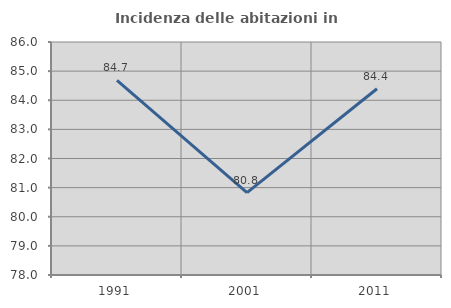
| Category | Incidenza delle abitazioni in proprietà  |
|---|---|
| 1991.0 | 84.679 |
| 2001.0 | 80.828 |
| 2011.0 | 84.396 |